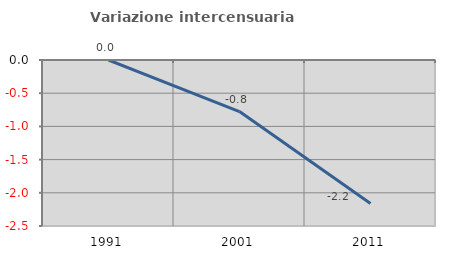
| Category | Variazione intercensuaria annua |
|---|---|
| 1991.0 | 0 |
| 2001.0 | -0.777 |
| 2011.0 | -2.162 |